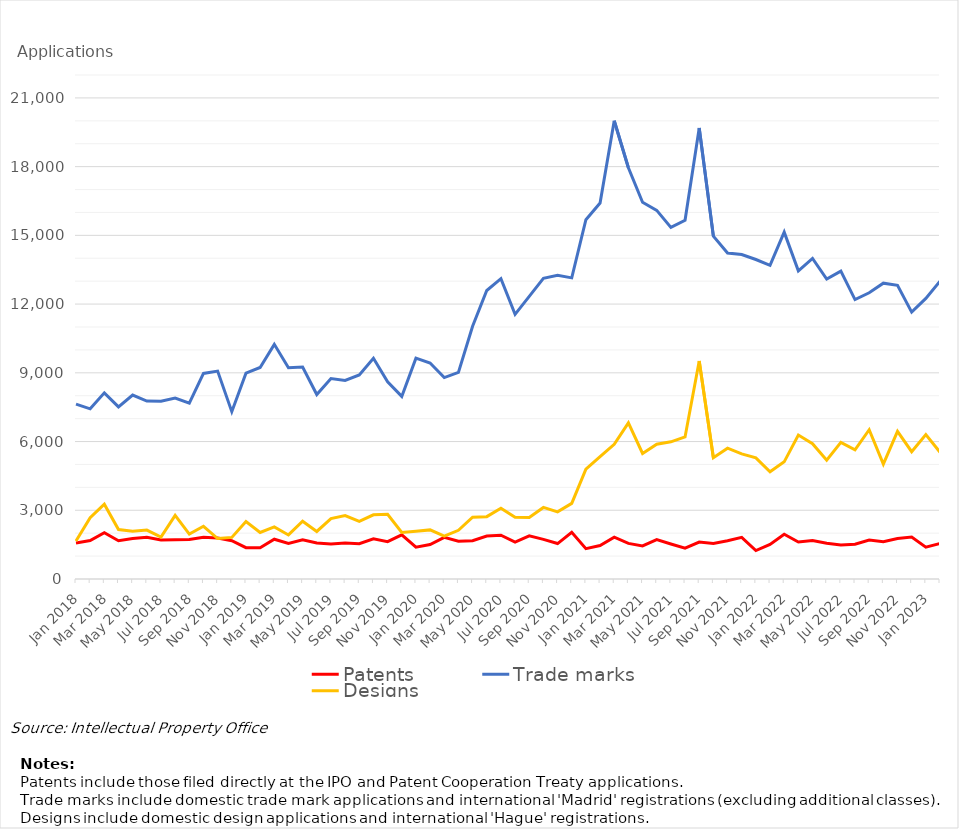
| Category | Patents | Trade marks | Designs |
|---|---|---|---|
| Jan 2018 | 1575 | 7634 | 1658 |
| Feb 2018 | 1676 | 7428 | 2672 |
| Mar 2018 | 2022 | 8127 | 3267 |
| Apr 2018 | 1670 | 7512 | 2160 |
| May 2018 | 1767 | 8030 | 2083 |
| Jun 2018 | 1821 | 7769 | 2136 |
| Jul 2018 | 1704 | 7757 | 1832 |
| Aug 2018 | 1713 | 7897 | 2777 |
| Sep 2018 | 1725 | 7673 | 1960 |
| Oct 2018 | 1818 | 8972 | 2302 |
| Nov 2018 | 1787 | 9076 | 1765 |
| Dec 2018 | 1670 | 7304 | 1815 |
| Jan 2019 | 1367 | 8985 | 2505 |
| Feb 2019 | 1361 | 9234 | 2031 |
| Mar 2019 | 1737 | 10243 | 2274 |
| Apr 2019 | 1552 | 9219 | 1923 |
| May 2019 | 1710 | 9251 | 2520 |
| Jun 2019 | 1569 | 8053 | 2074 |
| Jul 2019 | 1527 | 8752 | 2634 |
| Aug 2019 | 1571 | 8670 | 2768 |
| Sep 2019 | 1540 | 8907 | 2511 |
| Oct 2019 | 1755 | 9636 | 2800 |
| Nov 2019 | 1630 | 8607 | 2827 |
| Dec 2019 | 1926 | 7970 | 2028 |
| Jan 2020 | 1391 | 9642 | 2082 |
| Feb 2020 | 1504 | 9428 | 2143 |
| Mar 2020 | 1819 | 8794 | 1872 |
| Apr 2020 | 1648 | 9021 | 2127 |
| May 2020 | 1672 | 11035 | 2695 |
| Jun 2020 | 1879 | 12593 | 2721 |
| Jul 2020 | 1912 | 13110 | 3086 |
| Aug 2020 | 1613 | 11551 | 2695 |
| Sep 2020 | 1886 | 12340 | 2686 |
| Oct 2020 | 1730 | 13126 | 3124 |
| Nov 2020 | 1547 | 13254 | 2930 |
| Dec 2020 | 2042 | 13144 | 3302 |
| Jan 2021 | 1324 | 15685 | 4792 |
| Feb 2021 | 1462 | 16413 | 5340 |
| Mar 2021 | 1828 | 20001 | 5878 |
| Apr 2021 | 1554 | 17951 | 6815 |
| May 2021 | 1446 | 16446 | 5480 |
| Jun 2021 | 1716 | 16091 | 5881 |
| Jul 2021 | 1528 | 15345 | 5989 |
| Aug 2021 | 1344 | 15659 | 6200 |
| Sep 2021 | 1615 | 19685 | 9517 |
| Oct 2021 | 1547 | 14968 | 5292 |
| Nov 2021 | 1670 | 14232 | 5712 |
| Dec 2021 | 1818 | 14162 | 5464 |
| Jan 2022 | 1240 | 13946 | 5288 |
| Feb 2022 | 1506 | 13691 | 4683 |
| Mar 2022 | 1952 | 15142 | 5114 |
| Apr 2022 | 1616 | 13450 | 6282 |
| May 2022 | 1682 | 13992 | 5907 |
| Jun 2022 | 1559 | 13095 | 5183 |
| Jul 2022 | 1484 | 13439 | 5963 |
| Aug 2022 | 1520 | 12197 | 5639 |
| Sep 2022 | 1702 | 12494 | 6515 |
| Oct 2022 | 1630 | 12914 | 5012 |
| Nov 2022 | 1770 | 12819 | 6446 |
| Dec 2022 | 1828 | 11649 | 5557 |
| Jan 2023 | 1392 | 12249 | 6302 |
| Feb 2023 | 1551 | 12996 | 5533 |